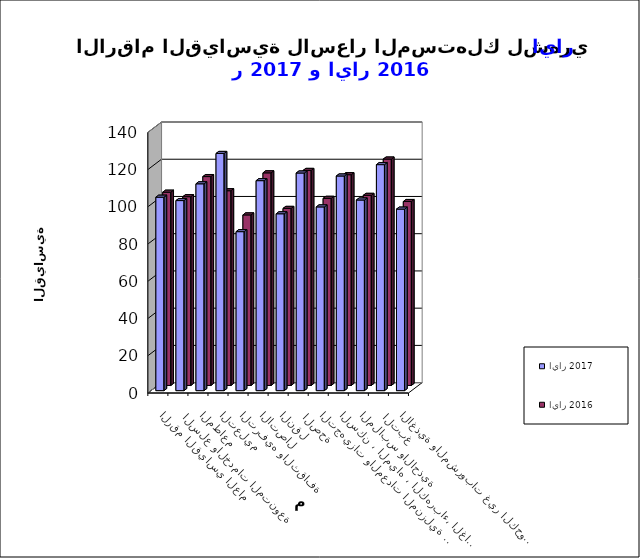
| Category | ايار 2017      | ايار 2016 |
|---|---|---|
| الاغذية والمشروبات غير الكحولية | 97.5 | 98.8 |
|  التبغ | 121.4 | 121.6 |
| الملابس والاحذية | 102.4 | 102.1 |
| السكن ، المياه ، الكهرباء، الغاز  | 115.3 | 113.2 |
| التجهيزات والمعدات المنزلية والصيانة | 98.7 | 100.5 |
|  الصحة | 116.9 | 115.5 |
| النقل | 95 | 95.1 |
| الاتصال | 112.8 | 114.2 |
| الترفيه والثقافة | 85.4 | 91.6 |
| التعليم | 127.4 | 104.6 |
| المطاعم  | 111.1 | 112.2 |
|  السلع والخدمات المتنوعة | 102.1 | 101.4 |
| الرقم القياسي العام | 103.9 | 103.8 |